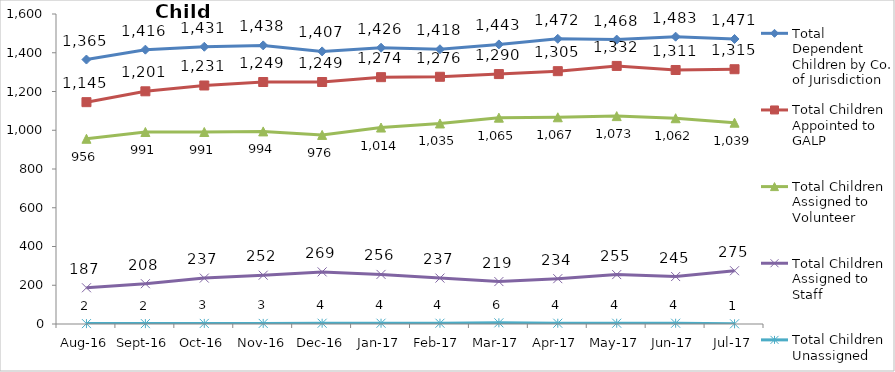
| Category | Total Dependent Children by Co. of Jurisdiction | Total Children Appointed to GALP | Total Children Assigned to Volunteer | Total Children Assigned to Staff | Total Children Unassigned |
|---|---|---|---|---|---|
| Aug-16 | 1365 | 1145 | 956 | 187 | 2 |
| Sep-16 | 1416 | 1201 | 991 | 208 | 2 |
| Oct-16 | 1431 | 1231 | 991 | 237 | 3 |
| Nov-16 | 1438 | 1249 | 994 | 252 | 3 |
| Dec-16 | 1407 | 1249 | 976 | 269 | 4 |
| Jan-17 | 1426 | 1274 | 1014 | 256 | 4 |
| Feb-17 | 1418 | 1276 | 1035 | 237 | 4 |
| Mar-17 | 1443 | 1290 | 1065 | 219 | 6 |
| Apr-17 | 1472 | 1305 | 1067 | 234 | 4 |
| May-17 | 1468 | 1332 | 1073 | 255 | 4 |
| Jun-17 | 1483 | 1311 | 1062 | 245 | 4 |
| Jul-17 | 1471 | 1315 | 1039 | 275 | 1 |